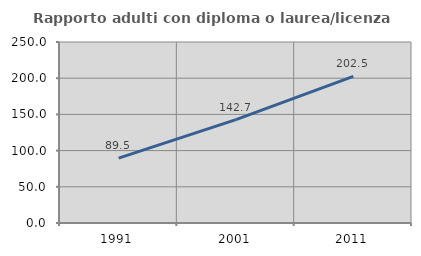
| Category | Rapporto adulti con diploma o laurea/licenza media  |
|---|---|
| 1991.0 | 89.52 |
| 2001.0 | 142.683 |
| 2011.0 | 202.538 |